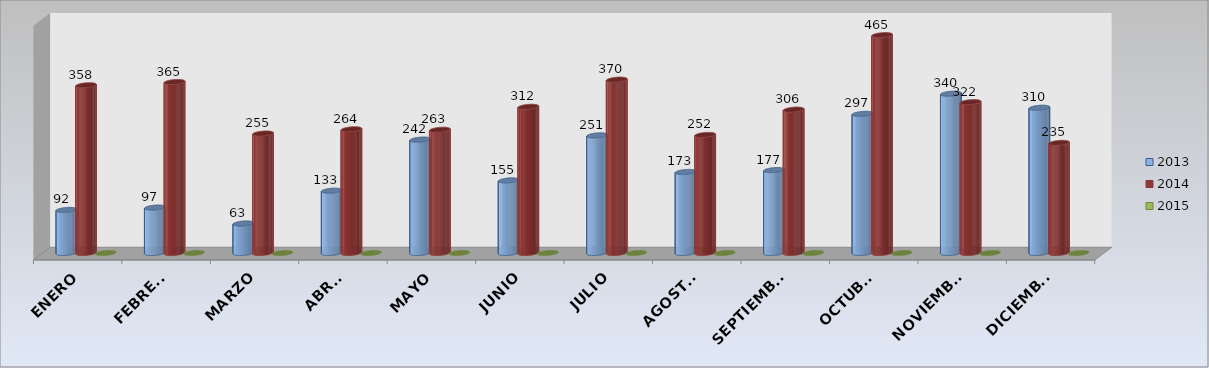
| Category | 2013 | 2014 | 2015 |
|---|---|---|---|
| ENERO | 92 | 358 | 0 |
| FEBRERO | 97 | 365 | 0 |
| MARZO | 63 | 255 | 0 |
| ABRIL | 133 | 264 | 0 |
| MAYO | 242 | 263 | 0 |
| JUNIO | 155 | 312 | 0 |
| JULIO | 251 | 370 | 0 |
| AGOSTO | 173 | 252 | 0 |
| SEPTIEMBRE | 177 | 306 | 0 |
| OCTUBRE | 297 | 465 | 0 |
| NOVIEMBRE | 340 | 322 | 0 |
| DICIEMBRE | 310 | 235 | 0 |